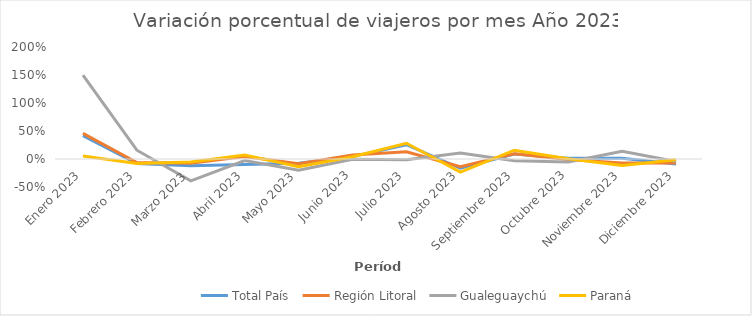
| Category | Total País | Región Litoral | Gualeguaychú | Paraná |
|---|---|---|---|---|
| Enero 2023 | 0.417 | 0.459 | 1.499 | 0.054 |
| Febrero 2023 | -0.078 | -0.062 | 0.157 | -0.079 |
| Marzo 2023 | -0.12 | -0.075 | -0.389 | -0.055 |
| Abril 2023 | -0.097 | 0.046 | -0.027 | 0.073 |
| Mayo 2023 | -0.076 | -0.086 | -0.201 | -0.14 |
| Junio 2023 | 0.043 | 0.073 | -0.004 | 0.041 |
| Julio 2023 | 0.255 | 0.13 | -0.014 | 0.281 |
| Agosto 2023 | -0.166 | -0.139 | 0.106 | -0.235 |
| Septiembre 2023 | 0.089 | 0.092 | -0.031 | 0.157 |
| Octubre 2023 | 0.014 | -0.008 | -0.054 | 0.005 |
| Noviembre 2023 | 0.012 | -0.071 | 0.137 | -0.117 |
| Diciembre 2023 | -0.088 | -0.069 | -0.046 | -0.014 |